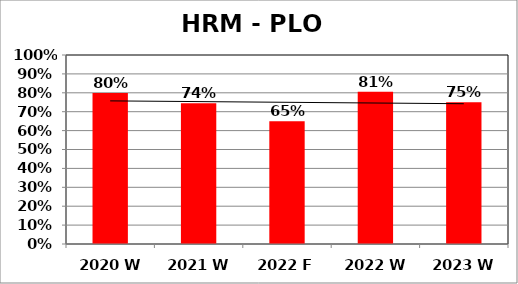
| Category | Series 0 |
|---|---|
| 2020 W | 0.799 |
| 2021 W | 0.744 |
| 2022 F | 0.65 |
| 2022 W | 0.805 |
| 2023 W | 0.75 |